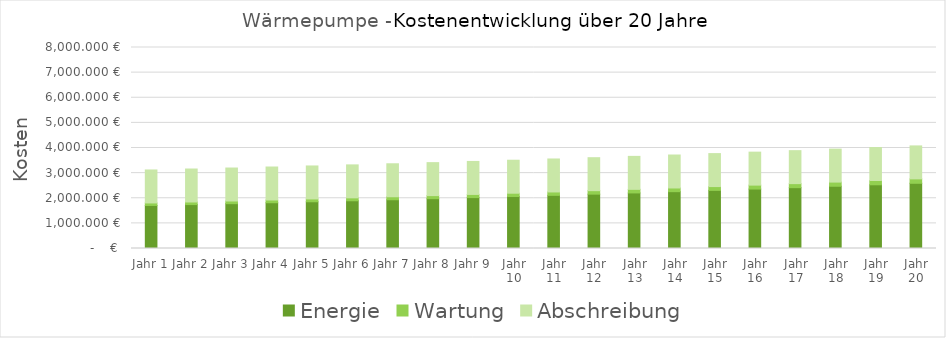
| Category | Energie | Wartung | Abschreibung |
|---|---|---|---|
| Jahr 1 | 1713.065 | 100 | 1312.5 |
| Jahr 2 | 1748.2 | 103 | 1312.5 |
| Jahr 3 | 1784.389 | 106.09 | 1312.5 |
| Jahr 4 | 1821.664 | 109.273 | 1312.5 |
| Jahr 5 | 1860.057 | 112.551 | 1312.5 |
| Jahr 6 | 1899.602 | 115.927 | 1312.5 |
| Jahr 7 | 1940.333 | 119.405 | 1312.5 |
| Jahr 8 | 1982.286 | 122.987 | 1312.5 |
| Jahr 9 | 2025.498 | 126.677 | 1312.5 |
| Jahr 10 | 2070.006 | 130.477 | 1312.5 |
| Jahr 11 | 2115.849 | 134.392 | 1312.5 |
| Jahr 12 | 2163.068 | 138.423 | 1312.5 |
| Jahr 13 | 2211.703 | 142.576 | 1312.5 |
| Jahr 14 | 2261.797 | 146.853 | 1312.5 |
| Jahr 15 | 2313.394 | 151.259 | 1312.5 |
| Jahr 16 | 2366.539 | 155.797 | 1312.5 |
| Jahr 17 | 2421.279 | 160.471 | 1312.5 |
| Jahr 18 | 2477.66 | 165.285 | 1312.5 |
| Jahr 19 | 2535.733 | 170.243 | 1312.5 |
| Jahr 20 | 2595.548 | 175.351 | 1312.5 |